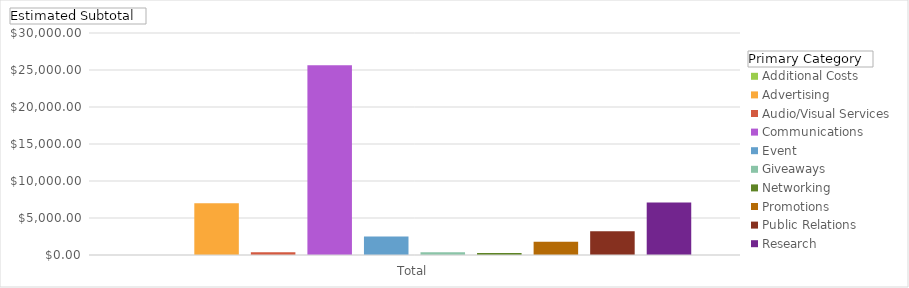
| Category | Additional Costs | Advertising | Audio/Visual Services | Communications | Event | Giveaways | Networking | Promotions | Public Relations | Research |
|---|---|---|---|---|---|---|---|---|---|---|
| Total | 0 | 7007 | 357 | 25650 | 2500 | 375 | 254 | 1800 | 3200 | 7100 |